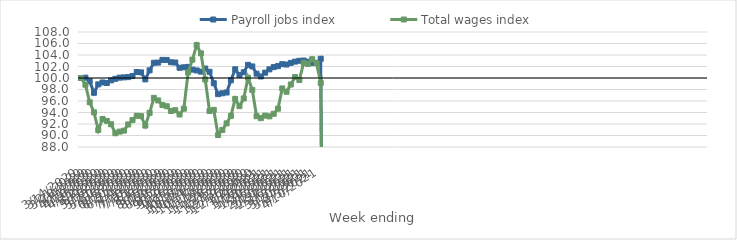
| Category | Payroll jobs index | Total wages index |
|---|---|---|
| 14/03/2020 | 100 | 100 |
| 21/03/2020 | 100.062 | 98.836 |
| 28/03/2020 | 99.439 | 95.786 |
| 04/04/2020 | 97.434 | 94.026 |
| 11/04/2020 | 98.893 | 90.946 |
| 18/04/2020 | 99.222 | 92.871 |
| 25/04/2020 | 99.136 | 92.545 |
| 02/05/2020 | 99.592 | 91.957 |
| 09/05/2020 | 99.858 | 90.39 |
| 16/05/2020 | 100.061 | 90.676 |
| 23/05/2020 | 100.111 | 90.844 |
| 30/05/2020 | 100.155 | 91.922 |
| 06/06/2020 | 100.355 | 92.674 |
| 13/06/2020 | 101.04 | 93.422 |
| 20/06/2020 | 100.976 | 93.366 |
| 27/06/2020 | 99.763 | 91.725 |
| 04/07/2020 | 101.334 | 93.942 |
| 11/07/2020 | 102.652 | 96.542 |
| 18/07/2020 | 102.682 | 96.1 |
| 25/07/2020 | 103.149 | 95.292 |
| 01/08/2020 | 103.138 | 95.086 |
| 08/08/2020 | 102.735 | 94.268 |
| 15/08/2020 | 102.688 | 94.401 |
| 22/08/2020 | 101.777 | 93.649 |
| 29/08/2020 | 101.856 | 94.662 |
| 05/09/2020 | 101.933 | 100.977 |
| 12/09/2020 | 101.456 | 103.187 |
| 19/09/2020 | 101.311 | 105.725 |
| 26/09/2020 | 101.106 | 104.293 |
| 03/10/2020 | 101.644 | 99.748 |
| 10/10/2020 | 101.084 | 94.258 |
| 17/10/2020 | 99.093 | 94.457 |
| 24/10/2020 | 97.194 | 90.083 |
| 31/10/2020 | 97.344 | 90.971 |
| 07/11/2020 | 97.475 | 92.111 |
| 14/11/2020 | 99.606 | 93.427 |
| 21/11/2020 | 101.513 | 96.36 |
| 28/11/2020 | 100.516 | 95.106 |
| 05/12/2020 | 101 | 96.444 |
| 12/12/2020 | 102.294 | 100.06 |
| 19/12/2020 | 102.011 | 97.93 |
| 26/12/2020 | 100.747 | 93.355 |
| 02/01/2021 | 100.268 | 93.02 |
| 09/01/2021 | 100.93 | 93.457 |
| 16/01/2021 | 101.505 | 93.326 |
| 23/01/2021 | 101.899 | 93.775 |
| 30/01/2021 | 102.068 | 94.664 |
| 06/02/2021 | 102.404 | 98.183 |
| 13/02/2021 | 102.341 | 97.614 |
| 20/02/2021 | 102.631 | 98.872 |
| 27/02/2021 | 102.849 | 100.169 |
| 06/03/2021 | 102.996 | 99.657 |
| 13/03/2021 | 103.037 | 102.655 |
| 20/03/2021 | 102.832 | 102.456 |
| 27/03/2021 | 102.62 | 103.269 |
| 03/04/2021 | 102.64 | 102.572 |
| 10/04/2021 | 103.346 | 99.126 |